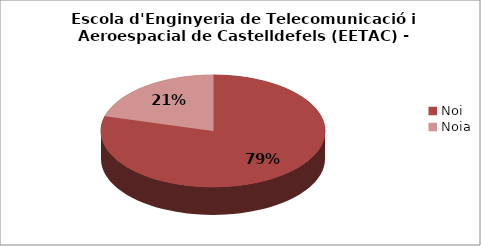
| Category | Escola d'Enginyeria de Telecomunicació i Aeroespacial de Castelldefels (EETAC) - Gènere |
|---|---|
| Noi | 0.792 |
| Noia | 0.208 |